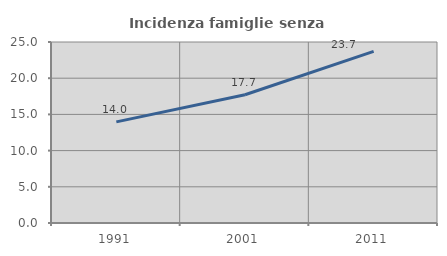
| Category | Incidenza famiglie senza nuclei |
|---|---|
| 1991.0 | 13.964 |
| 2001.0 | 17.71 |
| 2011.0 | 23.712 |